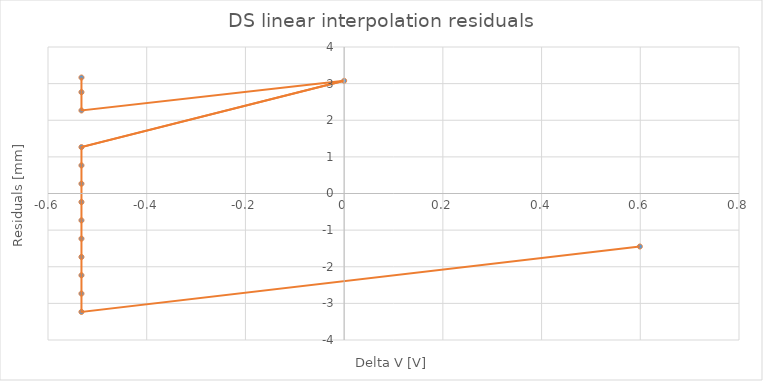
| Category | disabled |
|---|---|
| -0.5322 | 3.167 |
| -0.5322 | 2.767 |
| -0.5322 | 2.267 |
| 0.0 | 3.077 |
| -0.5322 | 1.267 |
| -0.5322 | 0.767 |
| -0.5322 | 0.267 |
| -0.5322 | -0.233 |
| -0.5322 | -0.733 |
| -0.5322 | -1.233 |
| -0.5322 | -1.733 |
| -0.5322 | -2.233 |
| -0.5322 | -2.733 |
| -0.5322 | -3.233 |
| 0.5991 | -1.448 |